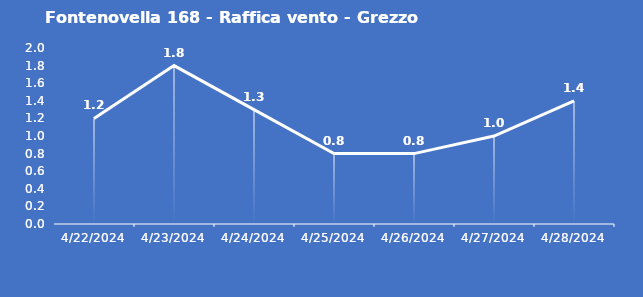
| Category | Fontenovella 168 - Raffica vento - Grezzo (m/s) |
|---|---|
| 4/22/24 | 1.2 |
| 4/23/24 | 1.8 |
| 4/24/24 | 1.3 |
| 4/25/24 | 0.8 |
| 4/26/24 | 0.8 |
| 4/27/24 | 1 |
| 4/28/24 | 1.4 |